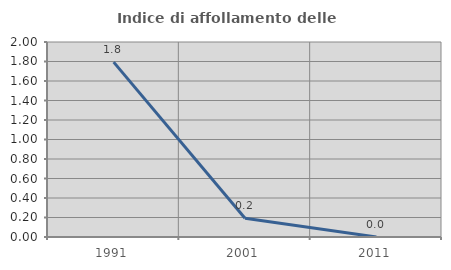
| Category | Indice di affollamento delle abitazioni  |
|---|---|
| 1991.0 | 1.794 |
| 2001.0 | 0.192 |
| 2011.0 | 0 |